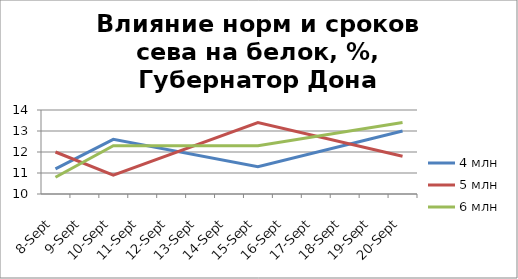
| Category | 4 млн | 5 млн | 6 млн |
|---|---|---|---|
| 2016-09-08 | 11.2 | 12 | 10.8 |
| 2016-09-10 | 12.6 | 10.9 | 12.3 |
| 2016-09-15 | 11.3 | 13.4 | 12.3 |
| 2016-09-20 | 13 | 11.8 | 13.4 |